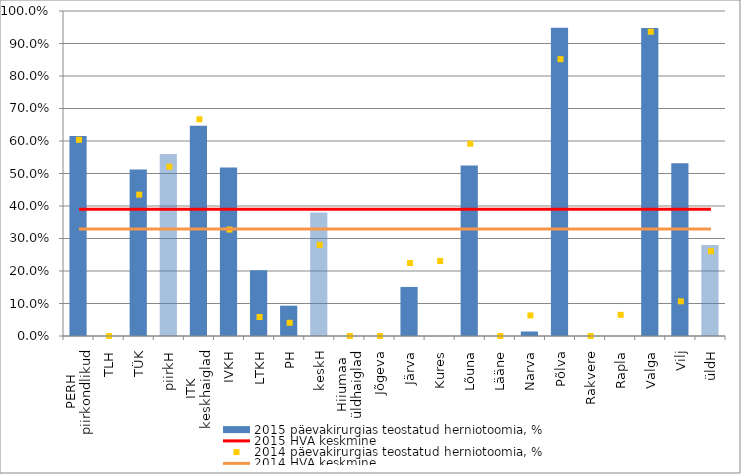
| Category | 2015 päevakirurgias teostatud herniotoomia, % |
|---|---|
| 0 | 0.615 |
| 1 | 0 |
| 2 | 0.512 |
| 3 | 0.56 |
| 4 | 0.647 |
| 5 | 0.519 |
| 6 | 0.202 |
| 7 | 0.093 |
| 8 | 0.38 |
| 9 | 0 |
| 10 | 0 |
| 11 | 0.151 |
| 12 | 0 |
| 13 | 0.525 |
| 14 | 0 |
| 15 | 0.014 |
| 16 | 0.949 |
| 17 | 0 |
| 18 | 0 |
| 19 | 0.947 |
| 20 | 0.531 |
| 21 | 0.28 |